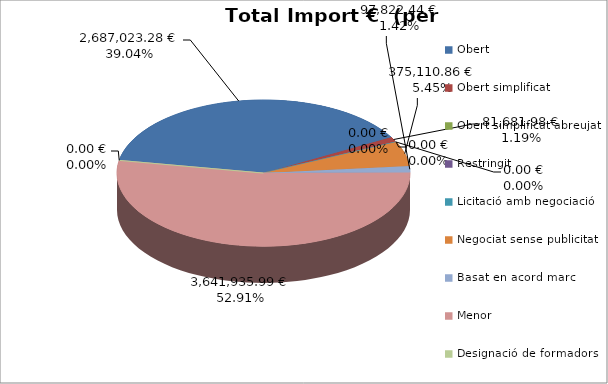
| Category | Total preu              (amb iva) |
|---|---|
| Obert | 2687023.28 |
| Obert simplificat | 81681.98 |
| Obert simplificat abreujat | 0 |
| Restringit | 0 |
| Licitació amb negociació | 0 |
| Negociat sense publicitat | 375110.86 |
| Basat en acord marc | 97822.44 |
| Menor | 3641935.99 |
| Designació de formadors | 0 |